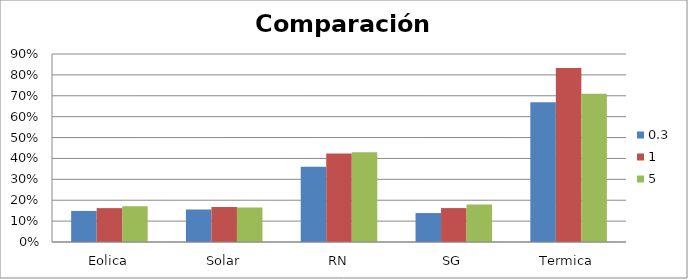
| Category | 0.3 | 1 | 5 |
|---|---|---|---|
| Eolica | 0.149 | 0.162 | 0.171 |
| Solar | 0.156 | 0.168 | 0.165 |
| RN | 0.36 | 0.424 | 0.429 |
| SG | 0.139 | 0.162 | 0.18 |
| Termica | 0.669 | 0.833 | 0.709 |